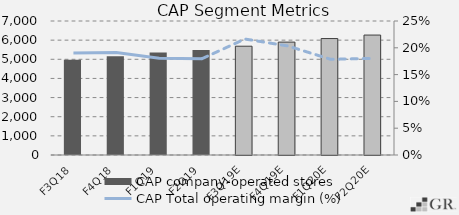
| Category | CAP company-operated stores |
|---|---|
|  F3Q18  | 4979 |
|  F4Q18  | 5159 |
|  F1Q19  | 5350 |
|  F2Q19  | 5483 |
|  F3Q19E  | 5683 |
|  F4Q19E  | 5898 |
|  F1Q20E  | 6082.75 |
|  F2Q20E  | 6265.938 |